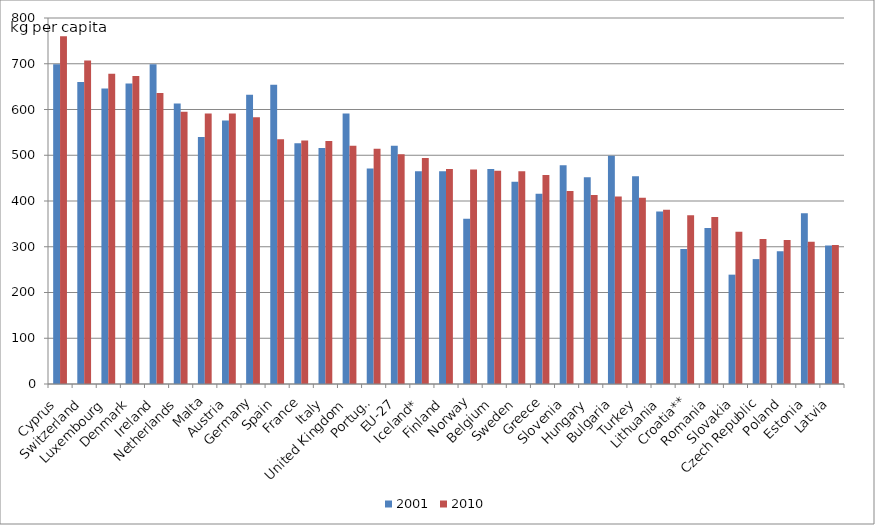
| Category | 2001 | 2010 |
|---|---|---|
| Cyprus | 699 | 760 |
| Switzerland | 660 | 707 |
| Luxembourg | 646 | 678 |
| Denmark | 657 | 673 |
| Ireland | 699 | 636 |
| Netherlands | 613 | 595 |
| Malta | 540 | 591 |
| Austria | 576 | 591 |
| Germany | 632 | 583 |
| Spain | 654 | 535 |
| France | 526 | 532 |
| Italy | 516 | 531 |
| United Kingdom | 591 | 521 |
| Portugal | 471 | 514 |
| EU-27 | 521 | 502 |
| Iceland* | 465 | 494 |
| Finland | 465 | 470 |
| Norway | 361 | 469 |
| Belgium | 470 | 466 |
| Sweden | 442 | 465 |
| Greece | 416 | 457 |
| Slovenia | 478 | 422 |
| Hungary | 452 | 413 |
| Bulgaria | 499 | 410 |
| Turkey | 454 | 407 |
| Lithuania | 377 | 381 |
| Croatia** | 295 | 369 |
| Romania | 341 | 365 |
| Slovakia | 239 | 333 |
| Czech Republic | 273 | 317 |
| Poland | 290 | 315 |
| Estonia | 373 | 311 |
| Latvia | 303 | 304 |